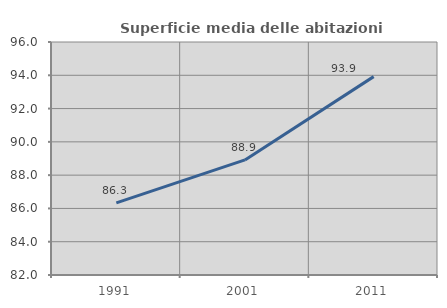
| Category | Superficie media delle abitazioni occupate |
|---|---|
| 1991.0 | 86.334 |
| 2001.0 | 88.913 |
| 2011.0 | 93.92 |